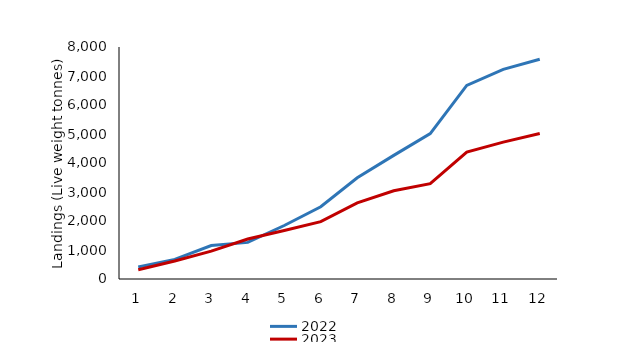
| Category | 2022 | 2023 |
|---|---|---|
| 0 | 415.869 | 321.552 |
| 1 | 676.649 | 621.688 |
| 2 | 1154.885 | 961.941 |
| 3 | 1262.769 | 1377.969 |
| 4 | 1845.236 | 1671.857 |
| 5 | 2491.406 | 1975.849 |
| 6 | 3488.5 | 2626.273 |
| 7 | 4263.406 | 3043.278 |
| 8 | 5012 | 3285.862 |
| 9 | 6677.235 | 4374.084 |
| 10 | 7229.578 | 4720.26 |
| 11 | 7579.587 | 5019.527 |